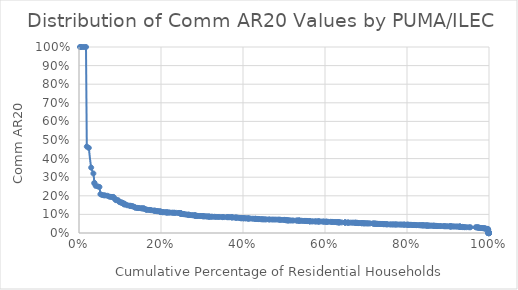
| Category | AR20_telco |
|---|---|
| 0.00229714126138637 | 1 |
| 0.00495848922516532 | 1 |
| 0.00862710108444612 | 1 |
| 0.0128187682704769 | 1 |
| 0.0170727015459645 | 1 |
| 0.0190291510220477 | 0.465 |
| 0.0238782995773975 | 0.458 |
| 0.0297063076322547 | 0.351 |
| 0.0350762595945656 | 0.32 |
| 0.0375487733970018 | 0.27 |
| 0.037548797520812 | 0.266 |
| 0.0408166205709661 | 0.253 |
| 0.0460948340376766 | 0.25 |
| 0.049898918549571 | 0.248 |
| 0.0521934453151817 | 0.209 |
| 0.0563885938600694 | 0.204 |
| 0.0603361751590204 | 0.203 |
| 0.0637178608244353 | 0.202 |
| 0.0696948751760665 | 0.2 |
| 0.0738931298593915 | 0.196 |
| 0.0776311826253582 | 0.194 |
| 0.0804904567267388 | 0.194 |
| 0.0839097531994093 | 0.194 |
| 0.084549828491472 | 0.19 |
| 0.0878790844912169 | 0.182 |
| 0.0899869719965334 | 0.18 |
| 0.0900931914797311 | 0.176 |
| 0.0953652918488062 | 0.176 |
| 0.0980820037525582 | 0.168 |
| 0.100478655636526 | 0.165 |
| 0.102145284770629 | 0.164 |
| 0.105034283492999 | 0.164 |
| 0.105034745664851 | 0.161 |
| 0.107743095890303 | 0.159 |
| 0.110176738944883 | 0.158 |
| 0.11020788457149 | 0.155 |
| 0.110216009637201 | 0.154 |
| 0.114039618565755 | 0.153 |
| 0.117614563450282 | 0.149 |
| 0.123010779739758 | 0.147 |
| 0.12618741416581 | 0.146 |
| 0.126191167440449 | 0.146 |
| 0.129876203146146 | 0.145 |
| 0.131188101184302 | 0.142 |
| 0.135465090051275 | 0.14 |
| 0.137694081106204 | 0.135 |
| 0.141616276389064 | 0.135 |
| 0.143849188840005 | 0.134 |
| 0.146492819106348 | 0.134 |
| 0.151512626953537 | 0.133 |
| 0.153571208268882 | 0.132 |
| 0.157038891128176 | 0.132 |
| 0.15704544996725 | 0.132 |
| 0.158848042221651 | 0.131 |
| 0.163179848608192 | 0.126 |
| 0.164169336239649 | 0.126 |
| 0.166249303294008 | 0.125 |
| 0.170970702758895 | 0.124 |
| 0.173634600796907 | 0.124 |
| 0.17618978026322 | 0.123 |
| 0.182190604052878 | 0.12 |
| 0.183692228502371 | 0.12 |
| 0.185943325483304 | 0.119 |
| 0.186001598420746 | 0.119 |
| 0.190537822078738 | 0.118 |
| 0.190637718368588 | 0.117 |
| 0.193954631179613 | 0.117 |
| 0.196986322309463 | 0.116 |
| 0.197434834874754 | 0.115 |
| 0.199371772274807 | 0.115 |
| 0.199371774146755 | 0.114 |
| 0.199647315879906 | 0.113 |
| 0.200109825502744 | 0.112 |
| 0.203476738555151 | 0.112 |
| 0.203865710373612 | 0.112 |
| 0.206020927623691 | 0.112 |
| 0.209042665413728 | 0.111 |
| 0.213431701904789 | 0.111 |
| 0.213605856160215 | 0.111 |
| 0.213605976754782 | 0.111 |
| 0.216374804767553 | 0.11 |
| 0.218781923686362 | 0.11 |
| 0.221475558025156 | 0.11 |
| 0.226538501813712 | 0.109 |
| 0.229261475195695 | 0.109 |
| 0.232507483959118 | 0.109 |
| 0.23379586068138 | 0.109 |
| 0.237884085394945 | 0.108 |
| 0.243768605194269 | 0.108 |
| 0.243768634599896 | 0.107 |
| 0.246917526002693 | 0.107 |
| 0.246917526104572 | 0.106 |
| 0.247724230068079 | 0.105 |
| 0.248282014538421 | 0.105 |
| 0.248282015816804 | 0.105 |
| 0.248318130286139 | 0.104 |
| 0.248585222407564 | 0.104 |
| 0.251623108457406 | 0.103 |
| 0.253514520121877 | 0.102 |
| 0.253927322687122 | 0.102 |
| 0.253952757663562 | 0.102 |
| 0.255066672556275 | 0.102 |
| 0.257852589379943 | 0.101 |
| 0.261298514257808 | 0.1 |
| 0.264571926805816 | 0.099 |
| 0.267652150078605 | 0.099 |
| 0.267652155486908 | 0.098 |
| 0.267687094459108 | 0.097 |
| 0.27066040759005 | 0.096 |
| 0.27466180278922 | 0.096 |
| 0.278015131368614 | 0.095 |
| 0.280678934449239 | 0.095 |
| 0.282584414279911 | 0.094 |
| 0.282893858446478 | 0.094 |
| 0.282893859528586 | 0.094 |
| 0.284673861418224 | 0.093 |
| 0.284673978970628 | 0.093 |
| 0.287370223193776 | 0.092 |
| 0.287370896681536 | 0.092 |
| 0.290356278482955 | 0.092 |
| 0.294615277098612 | 0.091 |
| 0.297164925497142 | 0.091 |
| 0.29813403236217 | 0.091 |
| 0.30250224662453 | 0.091 |
| 0.302659958105919 | 0.09 |
| 0.302659958326637 | 0.09 |
| 0.305962920903327 | 0.09 |
| 0.308288300881819 | 0.09 |
| 0.31245566215455 | 0.089 |
| 0.313552043898157 | 0.089 |
| 0.317578348173533 | 0.088 |
| 0.317613358019467 | 0.088 |
| 0.317770496886203 | 0.088 |
| 0.322164149325509 | 0.087 |
| 0.325132455240495 | 0.087 |
| 0.330413801303017 | 0.087 |
| 0.334064343927583 | 0.087 |
| 0.339003766617787 | 0.086 |
| 0.343434408865421 | 0.086 |
| 0.350088762110928 | 0.086 |
| 0.35008892219626 | 0.085 |
| 0.354224030345198 | 0.085 |
| 0.361215075191526 | 0.085 |
| 0.361641155493873 | 0.085 |
| 0.364788684792847 | 0.085 |
| 0.367695279864619 | 0.085 |
| 0.372522764274096 | 0.084 |
| 0.372579754625019 | 0.084 |
| 0.372660198574254 | 0.084 |
| 0.375438137334617 | 0.084 |
| 0.379758737114377 | 0.083 |
| 0.382782138458228 | 0.083 |
| 0.382793349609151 | 0.083 |
| 0.384383740491976 | 0.082 |
| 0.386868721572634 | 0.082 |
| 0.391546230733974 | 0.081 |
| 0.39327897461469 | 0.08 |
| 0.393436515662027 | 0.08 |
| 0.395440708607477 | 0.08 |
| 0.395529216695079 | 0.08 |
| 0.395706858243745 | 0.08 |
| 0.398525891730929 | 0.08 |
| 0.401327922095495 | 0.079 |
| 0.401435134351377 | 0.079 |
| 0.401974582743942 | 0.079 |
| 0.406034229714952 | 0.079 |
| 0.406892029746985 | 0.079 |
| 0.411332118454619 | 0.078 |
| 0.412526023251079 | 0.078 |
| 0.412526023279842 | 0.078 |
| 0.415281373139384 | 0.078 |
| 0.416200519989266 | 0.078 |
| 0.422465228421035 | 0.077 |
| 0.426605814304532 | 0.077 |
| 0.430716981762528 | 0.076 |
| 0.43081832767444 | 0.076 |
| 0.431036145825667 | 0.076 |
| 0.434533336438621 | 0.076 |
| 0.436988757445662 | 0.075 |
| 0.437000868774288 | 0.075 |
| 0.437675898137865 | 0.075 |
| 0.442146130056624 | 0.075 |
| 0.44513780128954 | 0.074 |
| 0.447755245602462 | 0.074 |
| 0.450092166041615 | 0.073 |
| 0.453372709852332 | 0.073 |
| 0.456738585095916 | 0.073 |
| 0.462905691724783 | 0.073 |
| 0.465265994585226 | 0.073 |
| 0.470926039696088 | 0.072 |
| 0.4752162749664 | 0.072 |
| 0.480019991976569 | 0.072 |
| 0.485506279334475 | 0.072 |
| 0.489275293450082 | 0.072 |
| 0.490212278687445 | 0.071 |
| 0.495055474596257 | 0.071 |
| 0.500544069557701 | 0.071 |
| 0.500589211455024 | 0.07 |
| 0.504515061883611 | 0.07 |
| 0.504639643932227 | 0.07 |
| 0.504752598964228 | 0.068 |
| 0.506577849470861 | 0.068 |
| 0.50928456756084 | 0.068 |
| 0.510536520115521 | 0.068 |
| 0.510580320609772 | 0.068 |
| 0.514395570745151 | 0.068 |
| 0.518386627367766 | 0.067 |
| 0.522808826763703 | 0.067 |
| 0.530155322596071 | 0.067 |
| 0.533040404265091 | 0.067 |
| 0.533139173364763 | 0.067 |
| 0.537143502673852 | 0.067 |
| 0.53749342117502 | 0.067 |
| 0.53760450146766 | 0.066 |
| 0.537693378680746 | 0.066 |
| 0.542628070148624 | 0.066 |
| 0.545941870322018 | 0.065 |
| 0.550865497592761 | 0.065 |
| 0.550971373906458 | 0.065 |
| 0.554012272110501 | 0.065 |
| 0.554012275191676 | 0.065 |
| 0.556429857605146 | 0.064 |
| 0.55674947625469 | 0.064 |
| 0.562582066465646 | 0.064 |
| 0.562624104412957 | 0.063 |
| 0.562690757091479 | 0.063 |
| 0.562758751209698 | 0.063 |
| 0.56714205218427 | 0.063 |
| 0.569892955340286 | 0.063 |
| 0.57496572951051 | 0.062 |
| 0.577287948033038 | 0.062 |
| 0.579210462550173 | 0.062 |
| 0.584210636878943 | 0.062 |
| 0.584210637542698 | 0.062 |
| 0.584210656631045 | 0.062 |
| 0.585731558407464 | 0.062 |
| 0.590071892255551 | 0.062 |
| 0.595686728180798 | 0.062 |
| 0.596095467691068 | 0.061 |
| 0.599444877338277 | 0.061 |
| 0.602902541427558 | 0.061 |
| 0.603585262941311 | 0.061 |
| 0.604549711430805 | 0.06 |
| 0.607348137333409 | 0.06 |
| 0.613203138985767 | 0.06 |
| 0.616709082514914 | 0.06 |
| 0.617475622699717 | 0.06 |
| 0.621049121581638 | 0.059 |
| 0.624282973248859 | 0.059 |
| 0.628259234896117 | 0.059 |
| 0.628880502582402 | 0.058 |
| 0.63208839219945 | 0.058 |
| 0.632089616475999 | 0.057 |
| 0.634298958179621 | 0.057 |
| 0.635156455876672 | 0.057 |
| 0.635330901045026 | 0.057 |
| 0.640471658997848 | 0.057 |
| 0.648784396926941 | 0.057 |
| 0.648784396929809 | 0.057 |
| 0.648799649766668 | 0.056 |
| 0.648820888437747 | 0.056 |
| 0.652188861532056 | 0.056 |
| 0.6565031213084 | 0.056 |
| 0.656503124649147 | 0.056 |
| 0.65679749143484 | 0.056 |
| 0.661971358915951 | 0.056 |
| 0.66659254600817 | 0.056 |
| 0.670013999514143 | 0.056 |
| 0.674016453386917 | 0.055 |
| 0.67473472025373 | 0.055 |
| 0.674753855376815 | 0.055 |
| 0.676807995775296 | 0.055 |
| 0.679523925453831 | 0.055 |
| 0.679529057307644 | 0.054 |
| 0.67953037002362 | 0.054 |
| 0.682382095878619 | 0.054 |
| 0.682520532386286 | 0.053 |
| 0.688721027864206 | 0.053 |
| 0.688764620292991 | 0.053 |
| 0.689298513404718 | 0.053 |
| 0.692939861930656 | 0.052 |
| 0.693210842351371 | 0.052 |
| 0.695999619999351 | 0.052 |
| 0.696589422210268 | 0.052 |
| 0.6995576934441 | 0.052 |
| 0.702194094494529 | 0.052 |
| 0.70436185650811 | 0.052 |
| 0.706594320845897 | 0.052 |
| 0.710228664358524 | 0.052 |
| 0.716989670754055 | 0.051 |
| 0.71778011634276 | 0.051 |
| 0.720611215162499 | 0.05 |
| 0.720643188433434 | 0.05 |
| 0.721648558122838 | 0.05 |
| 0.723908453538617 | 0.05 |
| 0.724579794669978 | 0.05 |
| 0.727488441641954 | 0.049 |
| 0.727558624751488 | 0.049 |
| 0.730199404647462 | 0.049 |
| 0.733589321680439 | 0.049 |
| 0.734228178060926 | 0.049 |
| 0.734288543301862 | 0.049 |
| 0.737022253373376 | 0.049 |
| 0.740736395996135 | 0.048 |
| 0.740736731102827 | 0.048 |
| 0.741665840295607 | 0.048 |
| 0.742797146416876 | 0.048 |
| 0.743650643248443 | 0.048 |
| 0.743653519474501 | 0.048 |
| 0.743725616564915 | 0.048 |
| 0.747048946615882 | 0.047 |
| 0.750190775835457 | 0.047 |
| 0.750190830800209 | 0.047 |
| 0.752941252853292 | 0.047 |
| 0.758075868594461 | 0.046 |
| 0.760705530316142 | 0.046 |
| 0.764329302070986 | 0.046 |
| 0.766063074239895 | 0.046 |
| 0.769868538224533 | 0.046 |
| 0.771633927263908 | 0.046 |
| 0.773908716338785 | 0.046 |
| 0.776692925131295 | 0.046 |
| 0.781787251594135 | 0.046 |
| 0.784721976313177 | 0.045 |
| 0.787869150367674 | 0.045 |
| 0.791468730028472 | 0.045 |
| 0.793452233818697 | 0.045 |
| 0.794082772313926 | 0.045 |
| 0.799053260104499 | 0.045 |
| 0.801333154598632 | 0.044 |
| 0.801696990074877 | 0.044 |
| 0.804290982749352 | 0.044 |
| 0.80485085052269 | 0.044 |
| 0.808273112844522 | 0.044 |
| 0.810630172123179 | 0.044 |
| 0.814531687870542 | 0.043 |
| 0.814630204839762 | 0.043 |
| 0.814630214785207 | 0.043 |
| 0.814709451765356 | 0.043 |
| 0.817946659549423 | 0.043 |
| 0.818211092552674 | 0.043 |
| 0.821877413110109 | 0.042 |
| 0.823599376618338 | 0.042 |
| 0.828068092621183 | 0.042 |
| 0.830774169037641 | 0.042 |
| 0.833063031804654 | 0.041 |
| 0.835333379854974 | 0.041 |
| 0.837054887390552 | 0.041 |
| 0.838606017225213 | 0.041 |
| 0.838607284574039 | 0.041 |
| 0.84122384799303 | 0.041 |
| 0.842653770572687 | 0.041 |
| 0.845658396762304 | 0.04 |
| 0.845990207621419 | 0.04 |
| 0.849193991082752 | 0.04 |
| 0.849943136574391 | 0.04 |
| 0.850048689982739 | 0.04 |
| 0.85006549437588 | 0.04 |
| 0.85389988020592 | 0.04 |
| 0.854947747056715 | 0.04 |
| 0.858513978410017 | 0.039 |
| 0.861757266971053 | 0.039 |
| 0.864839676488237 | 0.039 |
| 0.864981822942733 | 0.039 |
| 0.866706952930807 | 0.039 |
| 0.869076124032888 | 0.039 |
| 0.871419038019496 | 0.038 |
| 0.872972586459116 | 0.038 |
| 0.873291105599831 | 0.037 |
| 0.875498790119792 | 0.037 |
| 0.880066017468619 | 0.037 |
| 0.882689671443386 | 0.037 |
| 0.888425302926667 | 0.037 |
| 0.890739163673023 | 0.037 |
| 0.892988137253481 | 0.036 |
| 0.896331224348329 | 0.036 |
| 0.90038522418863 | 0.036 |
| 0.905306963154273 | 0.036 |
| 0.905307311558172 | 0.036 |
| 0.906031895598353 | 0.036 |
| 0.906031915903712 | 0.036 |
| 0.908036516950458 | 0.036 |
| 0.908572561768002 | 0.035 |
| 0.912493993549103 | 0.035 |
| 0.915268533442373 | 0.035 |
| 0.918822063715021 | 0.035 |
| 0.922146804990569 | 0.035 |
| 0.925366435590759 | 0.035 |
| 0.928244426582557 | 0.034 |
| 0.928584470750886 | 0.034 |
| 0.928585759231341 | 0.034 |
| 0.929599641755223 | 0.034 |
| 0.929599944961456 | 0.034 |
| 0.929599956510748 | 0.033 |
| 0.930129904658492 | 0.033 |
| 0.93543173829276 | 0.033 |
| 0.935432652857873 | 0.032 |
| 0.939184222666082 | 0.031 |
| 0.94094596032202 | 0.031 |
| 0.945439421369938 | 0.031 |
| 0.951430516934572 | 0.031 |
| 0.954712996130795 | 0.031 |
| 0.967477042056166 | 0.031 |
| 0.969799552153601 | 0.031 |
| 0.972342566301635 | 0.03 |
| 0.972461380283942 | 0.03 |
| 0.973589039266158 | 0.029 |
| 0.975972020042009 | 0.029 |
| 0.976315968003492 | 0.028 |
| 0.980001476094255 | 0.027 |
| 0.98004136664331 | 0.027 |
| 0.983189880211577 | 0.026 |
| 0.984307731497926 | 0.026 |
| 0.987030580785417 | 0.026 |
| 0.989472436942967 | 0.025 |
| 0.989858527363893 | 0.025 |
| 0.989858917173521 | 0.024 |
| 0.993517224768028 | 0.023 |
| 0.997231127657334 | 0.022 |
| 0.99724403218118 | 0.02 |
| 0.99724403218135 | 0.02 |
| 0.9972445453494 | 0.02 |
| 0.998333266825543 | 0.016 |
| 0.998334264962388 | 0 |
| 0.998355810942422 | 0 |
| 0.998357944862088 | 0 |
| 0.998359428081891 | 0 |
| 0.998362554459085 | 0 |
| 0.998457644023016 | 0 |
| 0.998458291497141 | 0 |
| 0.998464130125428 | 0 |
| 0.998527763236594 | 0 |
| 0.998527779600069 | 0 |
| 0.998530101642492 | 0 |
| 0.998532359059324 | 0 |
| 0.998532373237322 | 0 |
| 0.998532375849798 | 0 |
| 0.998535817490702 | 0 |
| 0.998652686877608 | 0 |
| 0.998684743726113 | 0 |
| 0.998686810814918 | 0 |
| 0.998688348848855 | 0 |
| 0.998777374242686 | 0 |
| 0.998847986974048 | 0 |
| 0.998848082789809 | 0 |
| 0.998895536877985 | 0 |
| 0.998895571439743 | 0 |
| 0.998941519871744 | 0 |
| 0.998942789403337 | 0 |
| 0.998943019616273 | 0 |
| 0.998943088833961 | 0 |
| 0.998944753160805 | 0 |
| 0.998944820854545 | 0 |
| 0.998951734526489 | 0 |
| 0.99895596971388 | 0 |
| 0.999079234948612 | 0 |
| 0.999079451565045 | 0 |
| 0.99908860204598 | 0 |
| 0.999254005132607 | 0 |
| 0.999254491410428 | 0 |
| 0.999267718176436 | 0 |
| 0.999269875192546 | 0 |
| 0.999269944297444 | 0 |
| 0.999274091401026 | 0 |
| 0.999283413896596 | 0 |
| 0.999328251415213 | 0 |
| 0.999332119679181 | 0 |
| 0.999352036934238 | 0 |
| 0.999352949534701 | 0 |
| 0.999571863903342 | 0 |
| 0.999572213823639 | 0 |
| 0.999660492171905 | 0 |
| 0.999671821977665 | 0 |
| 0.999687475146305 | 0 |
| 0.999705650629851 | 0 |
| 0.999705650734528 | 0 |
| 0.999705650734782 | 0 |
| 0.999705877403565 | 0 |
| 0.999705877405011 | 0 |
| 0.999726017910077 | 0 |
| 0.999734923950096 | 0 |
| 0.99973591109777 | 0 |
| 0.999737196681218 | 0 |
| 0.999748859671505 | 0 |
| 0.999748892374878 | 0 |
| 0.999749294097379 | 0 |
| 0.99978163058042 | 0 |
| 0.99978163084909 | 0 |
| 0.99978276586983 | 0 |
| 0.999784725498432 | 0 |
| 0.999784981198301 | 0 |
| 0.99978498193702 | 0 |
| 0.999784981937182 | 0 |
| 0.99978795606336 | 0 |
| 0.999792206434673 | 0 |
| 0.999816898649192 | 0 |
| 0.999825814594195 | 0 |
| 0.999826830940522 | 0 |
| 0.999826837726966 | 0 |
| 0.99983152115673 | 0 |
| 0.999833495778722 | 0 |
| 0.999834032472888 | 0 |
| 0.999834032556738 | 0 |
| 0.999840839752242 | 0 |
| 0.999841366026064 | 0 |
| 0.99984683719383 | 0 |
| 0.999850868313231 | 0 |
| 0.999874319210756 | 0 |
| 0.999945867491287 | 0 |
| 0.999945887720528 | 0 |
| 0.999945934199018 | 0 |
| 0.99995229160001 | 0 |
| 0.999952586841573 | 0 |
| 0.999952880668344 | 0 |
| 0.999962287786204 | 0 |
| 0.999971650318696 | 0 |
| 0.999978459984379 | 0 |
| 0.999980052339736 | 0 |
| 0.999999417659117 | 0 |
| 1.0 | 0 |